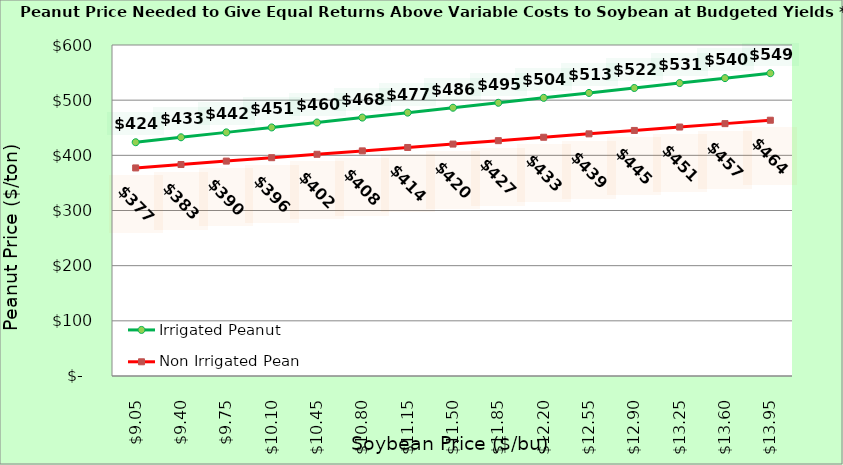
| Category | Irrigated Peanut | Non Irrigated Peanut |
|---|---|---|
| 9.050000000000002 | 423.758 | 377.178 |
| 9.400000000000002 | 432.694 | 383.354 |
| 9.750000000000002 | 441.631 | 389.531 |
| 10.100000000000001 | 450.567 | 395.707 |
| 10.450000000000001 | 459.503 | 401.884 |
| 10.8 | 468.439 | 408.06 |
| 11.15 | 477.375 | 414.237 |
| 11.5 | 486.311 | 420.413 |
| 11.85 | 495.248 | 426.59 |
| 12.2 | 504.184 | 432.766 |
| 12.549999999999999 | 513.12 | 438.943 |
| 12.899999999999999 | 522.056 | 445.119 |
| 13.249999999999998 | 530.992 | 451.295 |
| 13.599999999999998 | 539.928 | 457.472 |
| 13.949999999999998 | 548.865 | 463.648 |